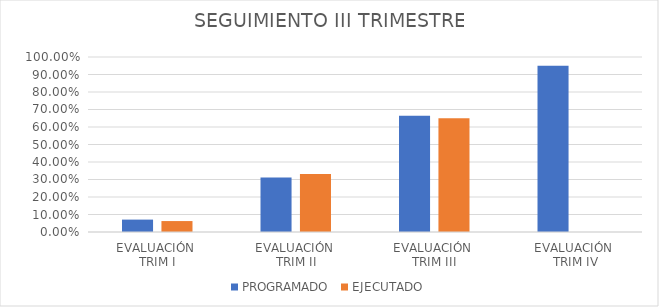
| Category | PROGRAMADO | EJECUTADO |
|---|---|---|
| EVALUACIÓN 
TRIM I | 0.071 | 0.062 |
| EVALUACIÓN 
TRIM II | 0.311 | 0.331 |
| EVALUACIÓN 
TRIM III | 0.664 | 0.65 |
| EVALUACIÓN
 TRIM IV | 0.95 | 0 |